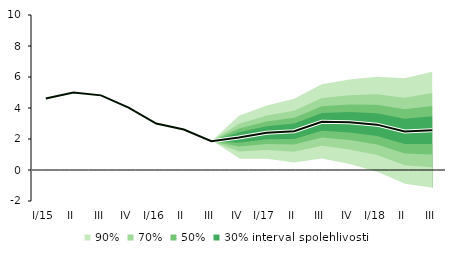
| Category | linka | Centerline |
|---|---|---|
| I/15 | 4.618 | 4.618 |
| II | 5.004 | 5.004 |
| III | 4.815 | 4.815 |
| IV | 4.027 | 4.027 |
| I/16 | 3 | 3 |
| II | 2.608 | 2.608 |
| III | 1.853 | 1.853 |
| IV | 2.096 | 2.096 |
| I/17 | 2.407 | 2.407 |
| II | 2.504 | 2.504 |
| III | 3.106 | 3.106 |
| IV | 3.078 | 3.078 |
| I/18 | 2.927 | 2.927 |
| II | 2.488 | 2.488 |
| III | 2.57 | 2.57 |